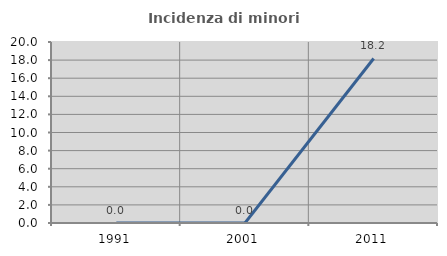
| Category | Incidenza di minori stranieri |
|---|---|
| 1991.0 | 0 |
| 2001.0 | 0 |
| 2011.0 | 18.182 |